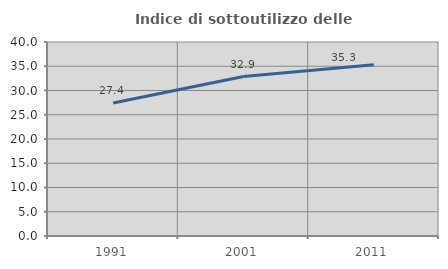
| Category | Indice di sottoutilizzo delle abitazioni  |
|---|---|
| 1991.0 | 27.44 |
| 2001.0 | 32.87 |
| 2011.0 | 35.314 |